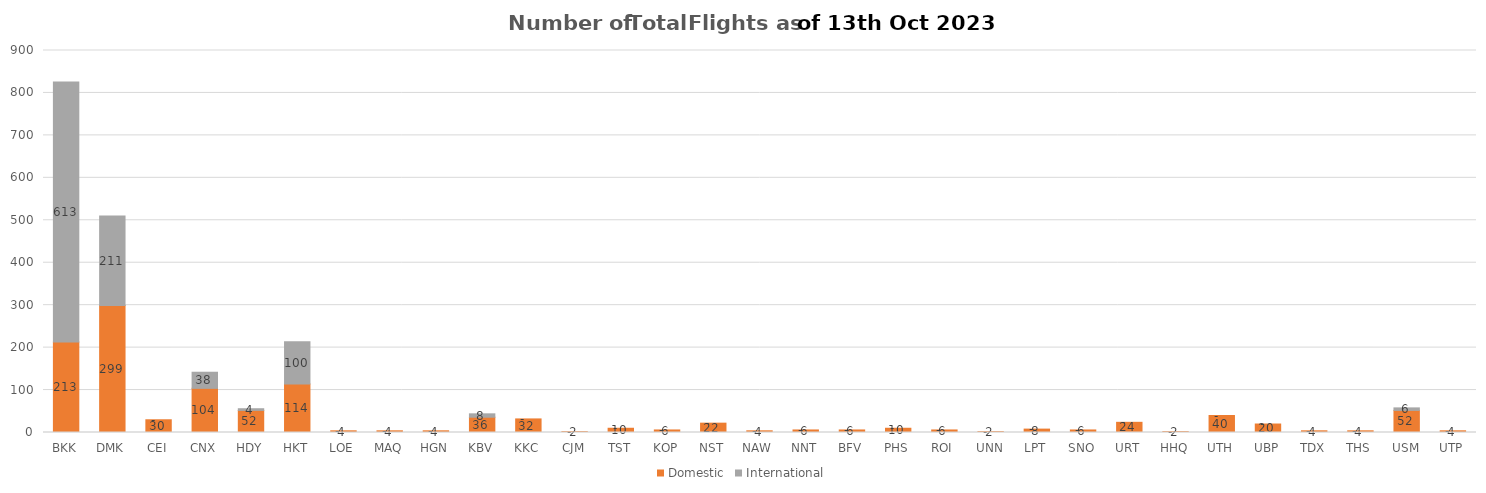
| Category | Domestic | International |
|---|---|---|
| BKK | 213 | 613 |
| DMK | 299 | 211 |
| CEI | 30 | 0 |
| CNX | 104 | 38 |
| HDY | 52 | 4 |
| HKT | 114 | 100 |
| LOE | 4 | 0 |
| MAQ | 4 | 0 |
| HGN | 4 | 0 |
| KBV | 36 | 8 |
| KKC | 32 | 0 |
| CJM | 2 | 0 |
| TST | 10 | 0 |
| KOP | 6 | 0 |
| NST | 22 | 0 |
| NAW | 4 | 0 |
| NNT | 6 | 0 |
| BFV | 6 | 0 |
| PHS | 10 | 0 |
| ROI | 6 | 0 |
| UNN | 2 | 0 |
| LPT | 8 | 0 |
| SNO | 6 | 0 |
| URT | 24 | 0 |
| HHQ | 2 | 0 |
| UTH | 40 | 0 |
| UBP | 20 | 0 |
| TDX | 4 | 0 |
| THS | 4 | 0 |
| USM | 52 | 6 |
| UTP | 4 | 0 |